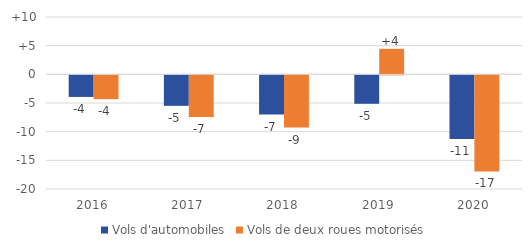
| Category | Vols d'automobiles | Vols de deux roues motorisés |
|---|---|---|
| 2016.0 | -3.77 | -4.157 |
| 2017.0 | -5.32 | -7.254 |
| 2018.0 | -6.836 | -9.121 |
| 2019.0 | -4.964 | 4.451 |
| 2020.0 | -11.106 | -16.763 |